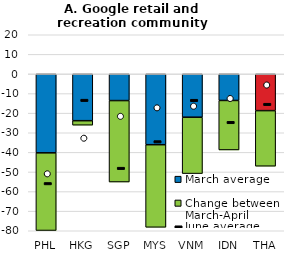
| Category | March average | Change between March-April |
|---|---|---|
| PHL | -40.258 | -39.609 |
| HKG | -23.839 | -2.295 |
| SGP | -13.581 | -41.553 |
| MYS | -36.097 | -42.137 |
| VNM | -22.065 | -28.769 |
| IDN | -13.516 | -25.251 |
| THA | -18.71 | -28.357 |